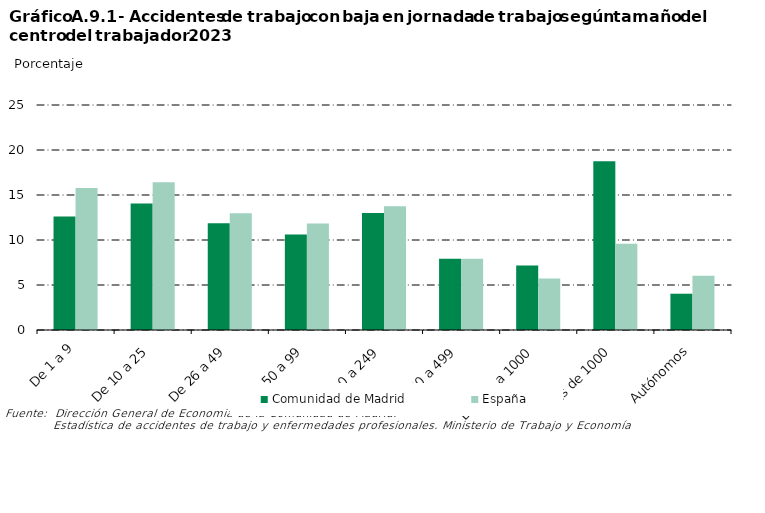
| Category | Comunidad de Madrid | España |
|---|---|---|
| 0 | 12.606 | 15.785 |
| 1 | 14.043 | 16.404 |
| 2 | 11.872 | 12.968 |
| 3 | 10.599 | 11.826 |
| 4 | 12.994 | 13.753 |
| 5 | 7.914 | 7.93 |
| 6 | 7.18 | 5.718 |
| 7 | 18.759 | 9.579 |
| 8 | 4.032 | 6.036 |